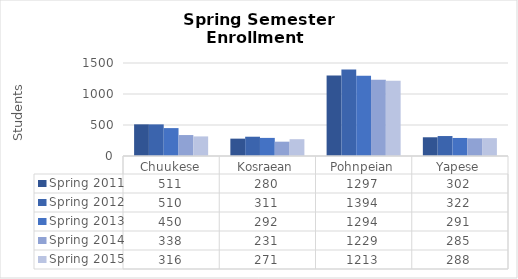
| Category | Spring 2011 | Spring 2012 | Spring 2013 | Spring 2014 | Spring 2015 |
|---|---|---|---|---|---|
| Chuukese | 511 | 510 | 450 | 338 | 316 |
| Kosraean | 280 | 311 | 292 | 231 | 271 |
| Pohnpeian | 1297 | 1394 | 1294 | 1229 | 1213 |
| Yapese | 302 | 322 | 291 | 285 | 288 |